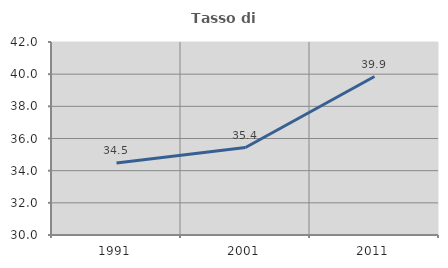
| Category | Tasso di occupazione   |
|---|---|
| 1991.0 | 34.483 |
| 2001.0 | 35.439 |
| 2011.0 | 39.853 |